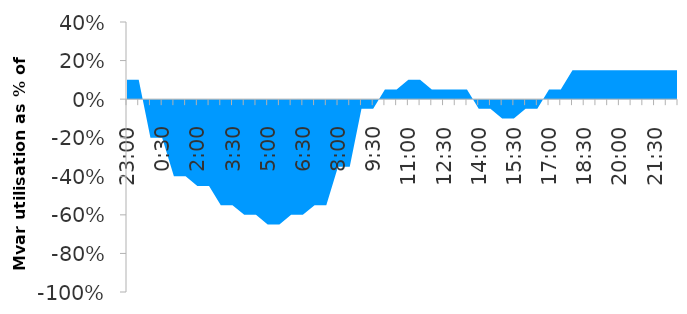
| Category | Series 0 |
|---|---|
| 0.9583333333333334 | 0.1 |
| 0.9791666666666666 | 0.1 |
| 0.0 | -0.2 |
| 0.020833333333333332 | -0.2 |
| 0.041666666666666664 | -0.4 |
| 0.0625 | -0.4 |
| 0.08333333333333333 | -0.45 |
| 0.10416666666666667 | -0.45 |
| 0.125 | -0.55 |
| 0.14583333333333334 | -0.55 |
| 0.16666666666666666 | -0.6 |
| 0.1875 | -0.6 |
| 0.20833333333333334 | -0.65 |
| 0.22916666666666666 | -0.65 |
| 0.25 | -0.6 |
| 0.2708333333333333 | -0.6 |
| 0.2916666666666667 | -0.55 |
| 0.3125 | -0.55 |
| 0.3333333333333333 | -0.35 |
| 0.3541666666666667 | -0.35 |
| 0.375 | -0.05 |
| 0.3958333333333333 | -0.05 |
| 0.4166666666666667 | 0.05 |
| 0.4375 | 0.05 |
| 0.4583333333333333 | 0.1 |
| 0.4791666666666667 | 0.1 |
| 0.5 | 0.05 |
| 0.5208333333333334 | 0.05 |
| 0.5416666666666666 | 0.05 |
| 0.5625 | 0.05 |
| 0.5833333333333334 | -0.05 |
| 0.6041666666666666 | -0.05 |
| 0.625 | -0.1 |
| 0.6458333333333334 | -0.1 |
| 0.6666666666666666 | -0.05 |
| 0.6875 | -0.05 |
| 0.7083333333333334 | 0.05 |
| 0.7291666666666666 | 0.05 |
| 0.75 | 0.15 |
| 0.7708333333333334 | 0.15 |
| 0.7916666666666666 | 0.15 |
| 0.8125 | 0.15 |
| 0.8333333333333334 | 0.15 |
| 0.8541666666666666 | 0.15 |
| 0.875 | 0.15 |
| 0.8958333333333334 | 0.15 |
| 0.9166666666666666 | 0.15 |
| 0.9375 | 0.15 |